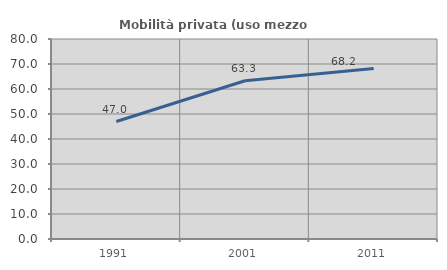
| Category | Mobilità privata (uso mezzo privato) |
|---|---|
| 1991.0 | 46.986 |
| 2001.0 | 63.308 |
| 2011.0 | 68.218 |